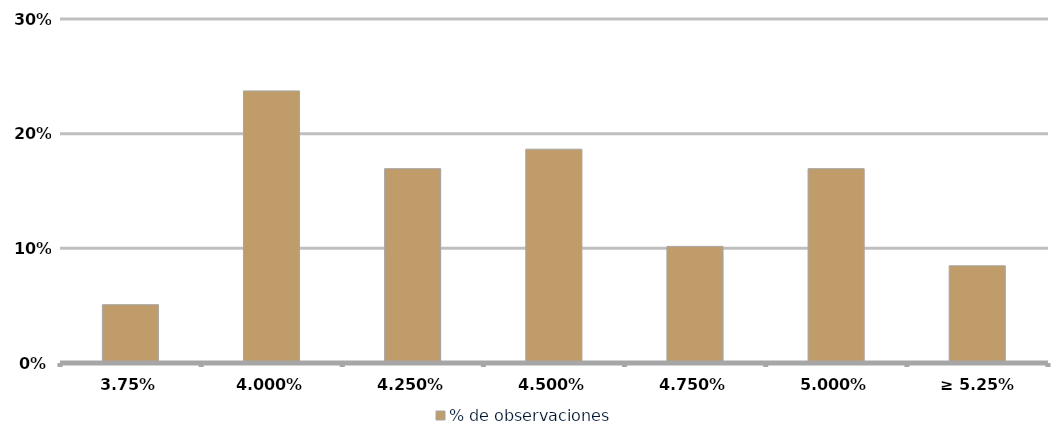
| Category | % de observaciones  |
|---|---|
| 3.75% | 0.051 |
| 4.00% | 0.237 |
| 4.25% | 0.169 |
| 4.50% | 0.186 |
| 4.75% | 0.102 |
| 5.00% | 0.169 |
| ≥ 5.25% | 0.085 |